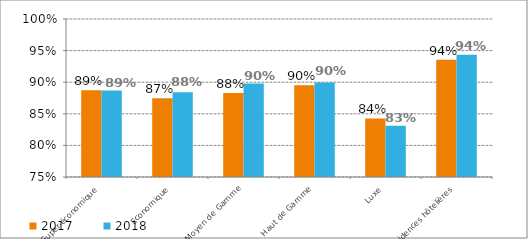
| Category | 2017 | 2018 |
|---|---|---|
| Super-économique | 0.887 | 0.887 |
| Economique | 0.874 | 0.884 |
| Moyen de Gamme | 0.883 | 0.898 |
| Haut de Gamme | 0.895 | 0.899 |
| Luxe | 0.843 | 0.831 |
| Résidences hôtelières | 0.935 | 0.943 |